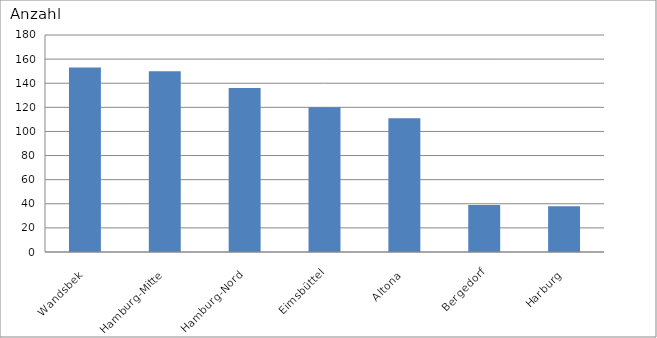
| Category | Wandsbek Hamburg-Mitte Hamburg-Nord Eimsbüttel Altona Bergedorf Harburg |
|---|---|
| Wandsbek | 153 |
| Hamburg-Mitte | 150 |
| Hamburg-Nord | 136 |
| Eimsbüttel | 120 |
| Altona | 111 |
| Bergedorf | 39 |
| Harburg | 38 |